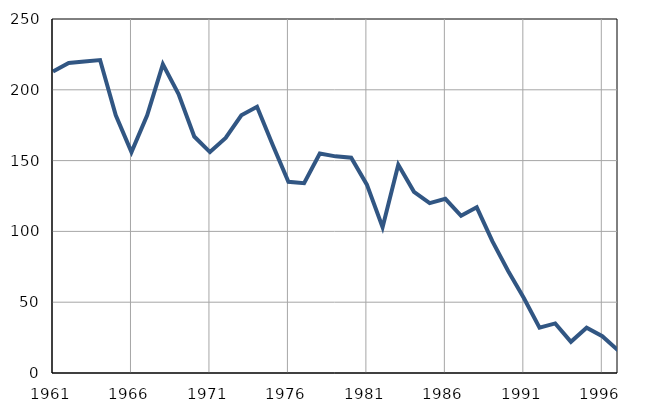
| Category | Infants
deaths |
|---|---|
| 1961.0 | 213 |
| 1962.0 | 219 |
| 1963.0 | 220 |
| 1964.0 | 221 |
| 1965.0 | 182 |
| 1966.0 | 156 |
| 1967.0 | 182 |
| 1968.0 | 218 |
| 1969.0 | 197 |
| 1970.0 | 167 |
| 1971.0 | 156 |
| 1972.0 | 166 |
| 1973.0 | 182 |
| 1974.0 | 188 |
| 1975.0 | 161 |
| 1976.0 | 135 |
| 1977.0 | 134 |
| 1978.0 | 155 |
| 1979.0 | 153 |
| 1980.0 | 152 |
| 1981.0 | 133 |
| 1982.0 | 103 |
| 1983.0 | 147 |
| 1984.0 | 128 |
| 1985.0 | 120 |
| 1986.0 | 123 |
| 1987.0 | 111 |
| 1988.0 | 117 |
| 1989.0 | 93 |
| 1990.0 | 72 |
| 1991.0 | 53 |
| 1992.0 | 32 |
| 1993.0 | 35 |
| 1994.0 | 22 |
| 1995.0 | 32 |
| 1996.0 | 26 |
| 1997.0 | 16 |